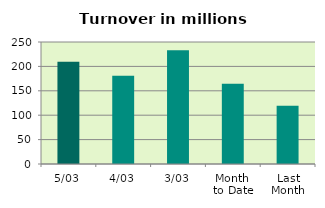
| Category | Series 0 |
|---|---|
| 5/03 | 209.6 |
| 4/03 | 180.986 |
| 3/03 | 233.323 |
| Month 
to Date | 164.267 |
| Last
Month | 119.242 |